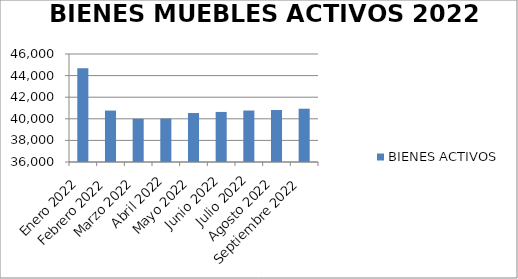
| Category | BIENES ACTIVOS |
|---|---|
| Enero 2022 | 44681 |
| Febrero 2022 | 40762 |
| Marzo 2022 | 40001 |
| Abril 2022 | 40019 |
| Mayo 2022 | 40534 |
| Junio 2022 | 40634 |
| Julio 2022 | 40766 |
| Agosto 2022 | 40814 |
| Septiembre 2022 | 40936 |